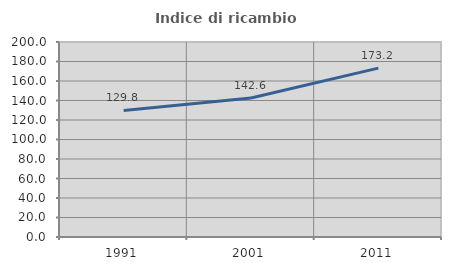
| Category | Indice di ricambio occupazionale  |
|---|---|
| 1991.0 | 129.787 |
| 2001.0 | 142.593 |
| 2011.0 | 173.239 |